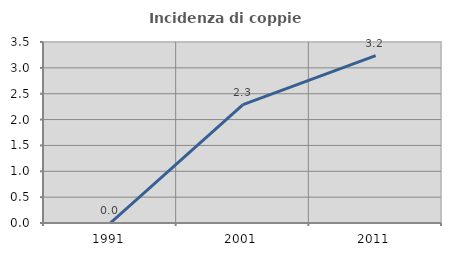
| Category | Incidenza di coppie miste |
|---|---|
| 1991.0 | 0 |
| 2001.0 | 2.29 |
| 2011.0 | 3.236 |